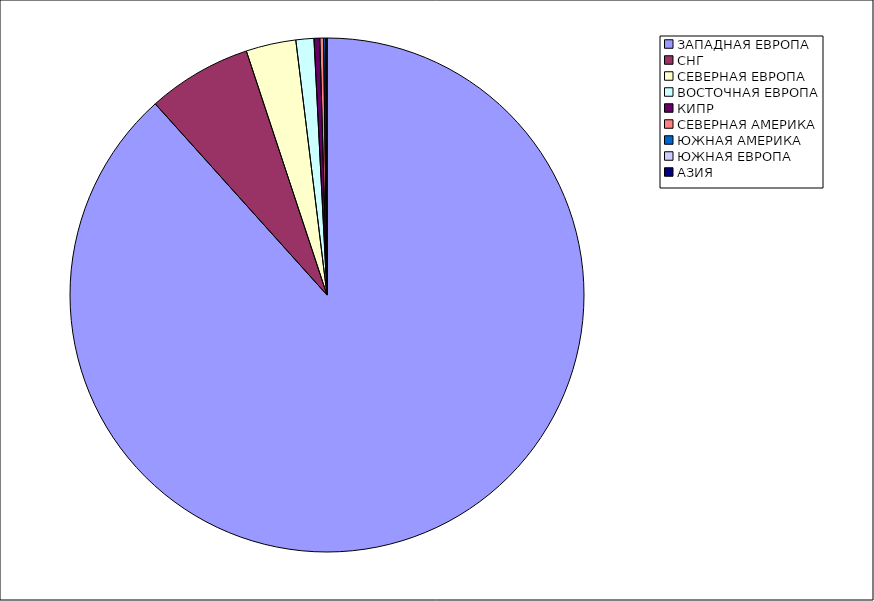
| Category | Оборот |
|---|---|
| ЗАПАДНАЯ ЕВРОПА | 0.884 |
| СНГ | 0.066 |
| СЕВЕРНАЯ ЕВРОПА | 0.031 |
| ВОСТОЧНАЯ ЕВРОПА | 0.011 |
| КИПР | 0.004 |
| СЕВЕРНАЯ АМЕРИКА | 0.002 |
| ЮЖНАЯ АМЕРИКА | 0.001 |
| ЮЖНАЯ ЕВРОПА | 0.001 |
| АЗИЯ | 0 |